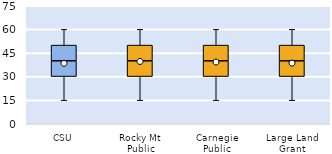
| Category | 25th | 50th | 75th |
|---|---|---|---|
| CSU | 30 | 10 | 10 |
| Rocky Mt Public | 30 | 10 | 10 |
| Carnegie Public | 30 | 10 | 10 |
| Large Land Grant | 30 | 10 | 10 |